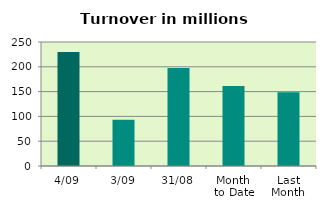
| Category | Series 0 |
|---|---|
| 4/09 | 229.804 |
| 3/09 | 93.055 |
| 31/08 | 197.625 |
| Month 
to Date | 161.429 |
| Last
Month | 148.736 |